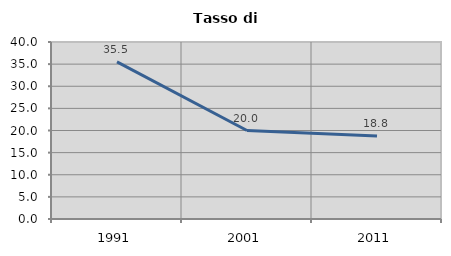
| Category | Tasso di disoccupazione   |
|---|---|
| 1991.0 | 35.523 |
| 2001.0 | 20 |
| 2011.0 | 18.75 |